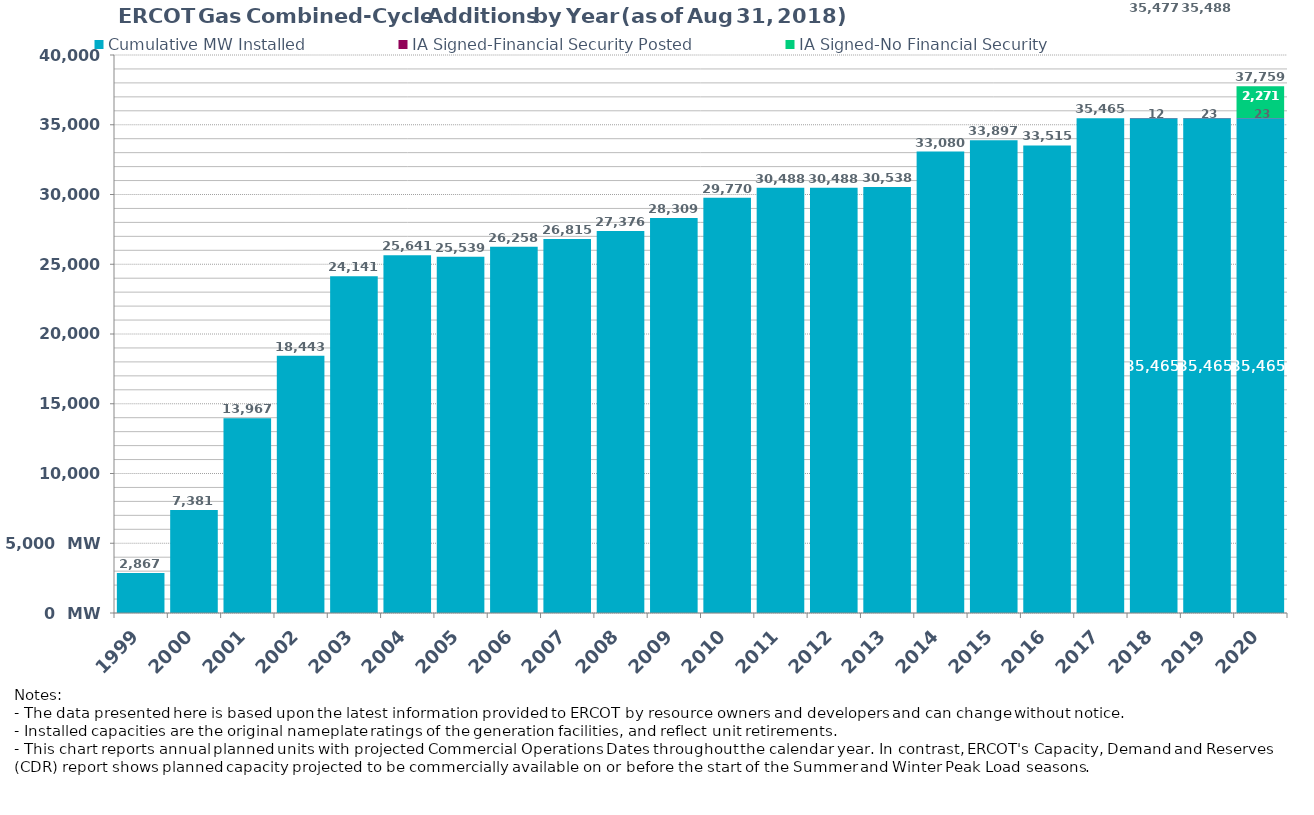
| Category | Cumulative MW Installed | IA Signed-Financial Security Posted  | IA Signed-No Financial Security  | Cumulative Installed and Planned |
|---|---|---|---|---|
| 1999.0 | 2867 | 0 | 0 | 2867 |
| 2000.0 | 7381 | 0 | 0 | 7381 |
| 2001.0 | 13967 | 0 | 0 | 13967 |
| 2002.0 | 18443 | 0 | 0 | 18443 |
| 2003.0 | 24141 | 0 | 0 | 24141 |
| 2004.0 | 25641 | 0 | 0 | 25641 |
| 2005.0 | 25539 | 0 | 0 | 25539 |
| 2006.0 | 26258 | 0 | 0 | 26258 |
| 2007.0 | 26815 | 0 | 0 | 26815 |
| 2008.0 | 27376 | 0 | 0 | 27376 |
| 2009.0 | 28309 | 0 | 0 | 28309 |
| 2010.0 | 29770 | 0 | 0 | 29770 |
| 2011.0 | 30488 | 0 | 0 | 30488 |
| 2012.0 | 30488 | 0 | 0 | 30488 |
| 2013.0 | 30538 | 0 | 0 | 30538 |
| 2014.0 | 33080 | 0 | 0 | 33080 |
| 2015.0 | 33897 | 0 | 0 | 33897 |
| 2016.0 | 33515 | 0 | 0 | 33515 |
| 2017.0 | 35465 | 0 | 0 | 35465 |
| 2018.0 | 35465 | 12 | 0 | 35477 |
| 2019.0 | 35465 | 23 | 0 | 35488 |
| 2020.0 | 35465 | 23 | 2270.8 | 37758.8 |